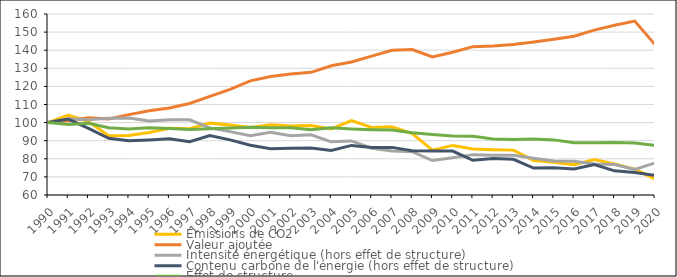
| Category | Émissions de CO2 | Valeur ajoutée | Intensité énergétique (hors effet de structure) | Contenu carbone de l'énergie (hors effet de structure) | Effet de structure |
|---|---|---|---|---|---|
| 1990.0 | 100 | 100 | 100 | 100 | 100 |
| 1991.0 | 104.086 | 101.077 | 102.126 | 101.942 | 98.912 |
| 1992.0 | 100.586 | 102.697 | 101.522 | 96.851 | 99.613 |
| 1993.0 | 92.681 | 102.001 | 102.445 | 91.326 | 97.119 |
| 1994.0 | 92.925 | 104.409 | 102.533 | 89.952 | 96.499 |
| 1995.0 | 94.516 | 106.567 | 100.943 | 90.419 | 97.173 |
| 1996.0 | 96.843 | 108.049 | 101.618 | 91.114 | 96.804 |
| 1997.0 | 96.572 | 110.542 | 101.538 | 89.39 | 96.251 |
| 1998.0 | 99.701 | 114.492 | 97.068 | 92.83 | 96.641 |
| 1999.0 | 98.733 | 118.367 | 95.025 | 90.451 | 97.047 |
| 2000.0 | 97.258 | 123.057 | 92.762 | 87.484 | 97.391 |
| 2001.0 | 98.748 | 125.428 | 94.695 | 85.591 | 97.134 |
| 2002.0 | 98.102 | 126.811 | 92.753 | 85.826 | 97.18 |
| 2003.0 | 98.392 | 127.782 | 93.293 | 85.935 | 96.045 |
| 2004.0 | 96.466 | 131.366 | 89.393 | 84.58 | 97.123 |
| 2005.0 | 101.132 | 133.483 | 89.861 | 87.403 | 96.464 |
| 2006.0 | 97.304 | 136.7 | 85.874 | 86.309 | 96.039 |
| 2007.0 | 97.646 | 139.997 | 84.31 | 86.305 | 95.857 |
| 2008.0 | 93.915 | 140.324 | 83.919 | 84.475 | 94.41 |
| 2009.0 | 84.801 | 136.253 | 79.018 | 84.267 | 93.47 |
| 2010.0 | 87.397 | 138.896 | 80.594 | 84.265 | 92.653 |
| 2011.0 | 85.45 | 141.955 | 82.304 | 79.153 | 92.401 |
| 2012.0 | 85.006 | 142.308 | 82.006 | 80.111 | 90.925 |
| 2013.0 | 84.795 | 143.171 | 81.924 | 79.744 | 90.658 |
| 2014.0 | 79.096 | 144.504 | 80.327 | 74.91 | 90.965 |
| 2015.0 | 78.131 | 146.092 | 78.814 | 75.022 | 90.449 |
| 2016.0 | 76.765 | 147.693 | 78.65 | 74.406 | 88.816 |
| 2017.0 | 79.546 | 151.077 | 77.086 | 76.81 | 88.926 |
| 2018.0 | 77.091 | 153.786 | 76.85 | 73.335 | 88.947 |
| 2019.0 | 74.263 | 156.106 | 74.094 | 72.403 | 88.677 |
| 2020.0 | 68.83 | 143.085 | 77.706 | 70.847 | 87.38 |